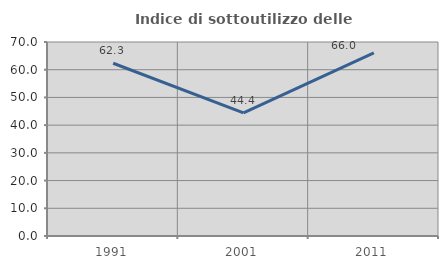
| Category | Indice di sottoutilizzo delle abitazioni  |
|---|---|
| 1991.0 | 62.338 |
| 2001.0 | 44.444 |
| 2011.0 | 66.038 |